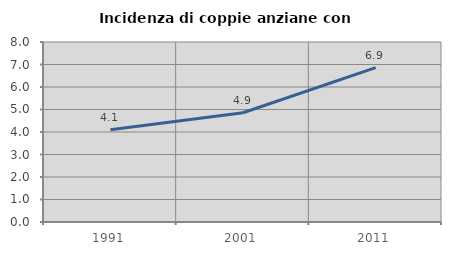
| Category | Incidenza di coppie anziane con figli |
|---|---|
| 1991.0 | 4.103 |
| 2001.0 | 4.854 |
| 2011.0 | 6.863 |